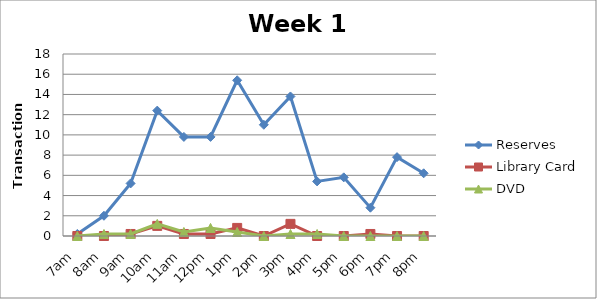
| Category | Reserves | Library Card | DVD |
|---|---|---|---|
| 7am | 0.2 | 0 | 0 |
| 8am | 2 | 0 | 0.2 |
| 9am | 5.2 | 0.2 | 0.2 |
| 10am | 12.4 | 1 | 1.2 |
| 11am | 9.8 | 0.2 | 0.4 |
| 12pm | 9.8 | 0.2 | 0.8 |
| 1pm | 15.4 | 0.8 | 0.4 |
| 2pm | 11 | 0 | 0 |
| 3pm | 13.8 | 1.2 | 0.2 |
| 4pm | 5.4 | 0 | 0.2 |
| 5pm | 5.8 | 0 | 0 |
| 6pm | 2.8 | 0.2 | 0 |
| 7pm | 7.8 | 0 | 0 |
| 8pm | 6.2 | 0 | 0 |